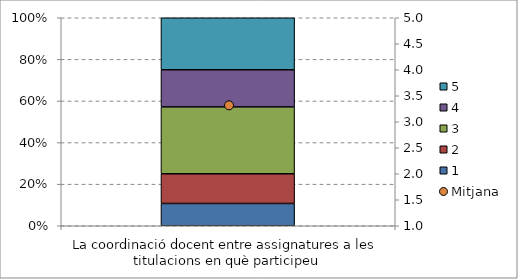
| Category | 1 | 2 | 3 | 4 | 5 |
|---|---|---|---|---|---|
| La coordinació docent entre assignatures a les titulacions en què participeu | 0.107 | 0.143 | 0.321 | 0.179 | 0.25 |